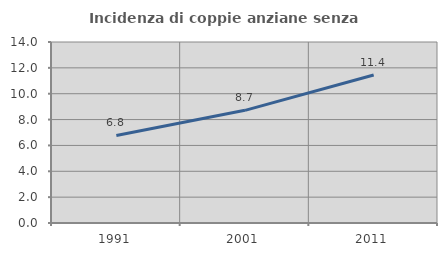
| Category | Incidenza di coppie anziane senza figli  |
|---|---|
| 1991.0 | 6.768 |
| 2001.0 | 8.714 |
| 2011.0 | 11.444 |